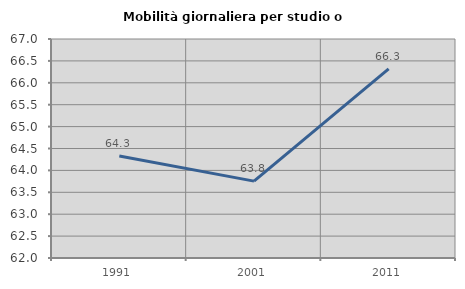
| Category | Mobilità giornaliera per studio o lavoro |
|---|---|
| 1991.0 | 64.33 |
| 2001.0 | 63.756 |
| 2011.0 | 66.318 |